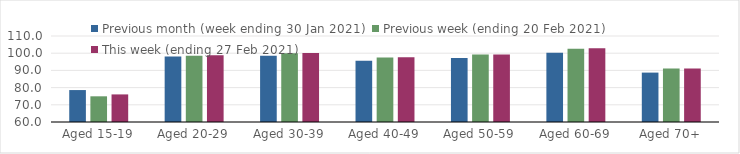
| Category | Previous month (week ending 30 Jan 2021) | Previous week (ending 20 Feb 2021) | This week (ending 27 Feb 2021) |
|---|---|---|---|
| Aged 15-19 | 78.57 | 74.94 | 76.04 |
| Aged 20-29 | 98.12 | 98.47 | 98.8 |
| Aged 30-39 | 98.5 | 99.96 | 100.11 |
| Aged 40-49 | 95.65 | 97.54 | 97.58 |
| Aged 50-59 | 97.28 | 99.24 | 99.29 |
| Aged 60-69 | 100.26 | 102.56 | 102.88 |
| Aged 70+ | 88.72 | 91.14 | 91.17 |